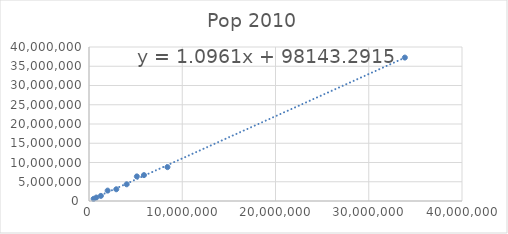
| Category | Pop 2010 |
|---|---|
| 493782.0 | 563626 |
| 783600.0 | 897934 |
| 1274923.0 | 1328361 |
| 1998257.0 | 2700551 |
| 2926324.0 | 3046355 |
| 4041769.0 | 4339367 |
| 5130632.0 | 6392017 |
| 5894121.0 | 6724540 |
| 8414350.0 | 8791894 |
| 33871648.0 | 37253956 |